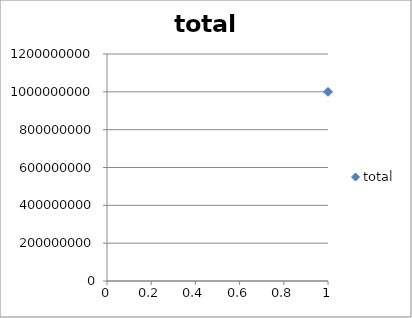
| Category | total |
|---|---|
| 0 | 1000000000 |
| 1 | 470960000 |
| 2 | 222562240 |
| 3 | 105610223.36 |
| 4 | 50361123.159 |
| 5 | 24155189.267 |
| 6 | 11664832.131 |
| 7 | 5677440.209 |
| 8 | 2788007.955 |
| 9 | 1382767.596 |
| 10 | 693300.669 |
| 11 | 351675.483 |
| 12 | 180568.129 |
| 13 | 93870.22 |
| 14 | 49406.015 |
| 15 | 26317.526 |
| 16 | 14179.35 |
| 17 | 7720.669 |
| 18 | 4244.432 |
| 19 | 2353.4 |
| 20 | 1314.689 |
| 21 | 739.188 |
| 22 | 417.903 |
| 23 | 237.361 |